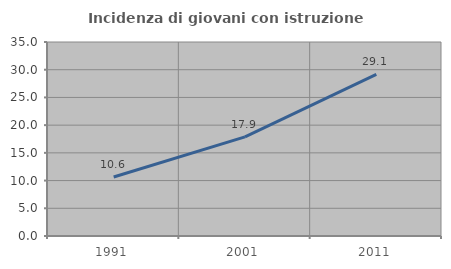
| Category | Incidenza di giovani con istruzione universitaria |
|---|---|
| 1991.0 | 10.638 |
| 2001.0 | 17.879 |
| 2011.0 | 29.142 |